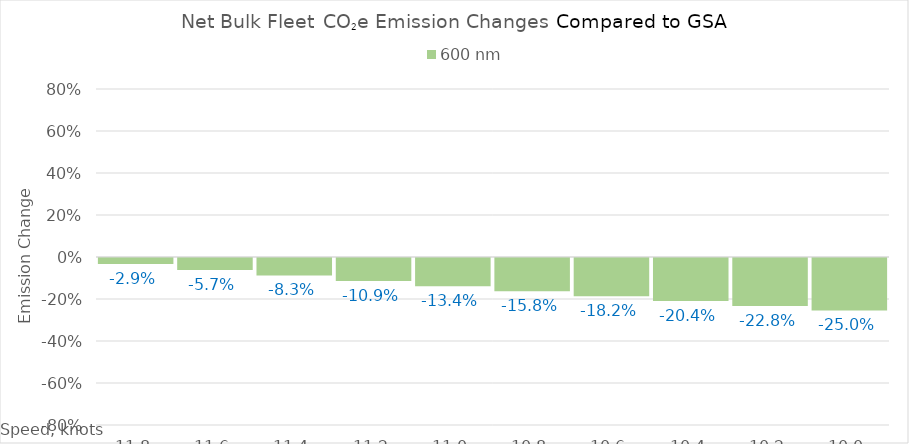
| Category | 600 |
|---|---|
| 11.8 | -0.029 |
| 11.600000000000001 | -0.057 |
| 11.400000000000002 | -0.083 |
| 11.200000000000003 | -0.109 |
| 11.000000000000004 | -0.134 |
| 10.800000000000004 | -0.158 |
| 10.600000000000005 | -0.182 |
| 10.400000000000006 | -0.204 |
| 10.200000000000006 | -0.228 |
| 10.000000000000007 | -0.25 |